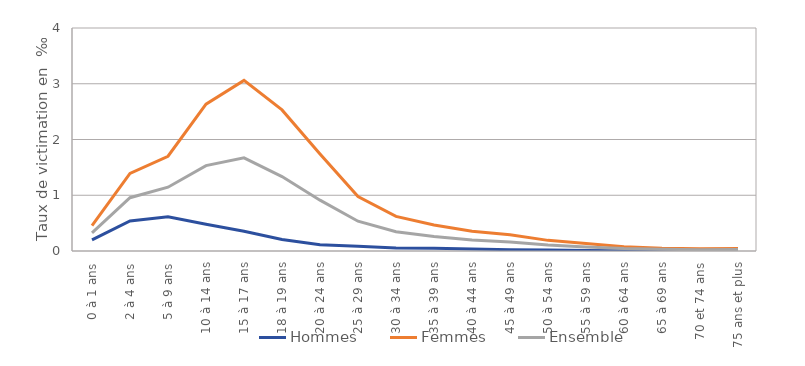
| Category | Hommes | Femmes | Ensemble |
|---|---|---|---|
| 0 à 1 ans | 0.199 | 0.456 | 0.325 |
| 2 à 4 ans | 0.54 | 1.39 | 0.956 |
| 5 à 9 ans | 0.612 | 1.7 | 1.144 |
| 10 à 14 ans | 0.48 | 2.633 | 1.531 |
| 15 à 17 ans | 0.356 | 3.06 | 1.671 |
| 18 à 19 ans | 0.207 | 2.531 | 1.335 |
| 20 à 24 ans | 0.111 | 1.741 | 0.912 |
| 25 à 29 ans | 0.084 | 0.978 | 0.535 |
| 30 à 34 ans | 0.055 | 0.62 | 0.344 |
| 35 à 39 ans | 0.047 | 0.466 | 0.262 |
| 40 à 44 ans | 0.036 | 0.354 | 0.198 |
| 45 à 49 ans | 0.024 | 0.292 | 0.159 |
| 50 à 54 ans | 0.02 | 0.191 | 0.107 |
| 55 à 59 ans | 0.011 | 0.133 | 0.073 |
| 60 à 64 ans | 0.006 | 0.077 | 0.043 |
| 65 à 69 ans | 0.007 | 0.051 | 0.03 |
| 70 et 74 ans | 0.003 | 0.042 | 0.024 |
| 75 ans et plus | 0.005 | 0.043 | 0.028 |